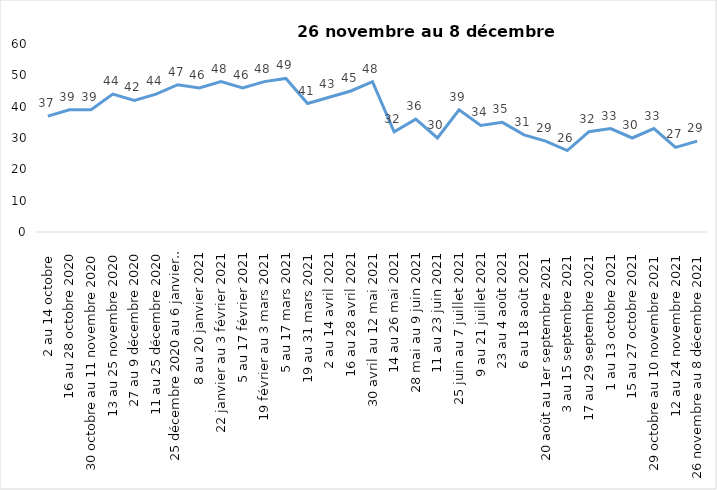
| Category | Toujours aux trois mesures |
|---|---|
| 2 au 14 octobre  | 37 |
| 16 au 28 octobre 2020 | 39 |
| 30 octobre au 11 novembre 2020 | 39 |
| 13 au 25 novembre 2020 | 44 |
| 27 au 9 décembre 2020 | 42 |
| 11 au 25 décembre 2020 | 44 |
| 25 décembre 2020 au 6 janvier  2021 | 47 |
| 8 au 20 janvier 2021 | 46 |
| 22 janvier au 3 février 2021 | 48 |
| 5 au 17 février 2021 | 46 |
| 19 février au 3 mars 2021 | 48 |
| 5 au 17 mars 2021 | 49 |
| 19 au 31 mars 2021 | 41 |
| 2 au 14 avril 2021 | 43 |
| 16 au 28 avril 2021 | 45 |
| 30 avril au 12 mai 2021 | 48 |
| 14 au 26 mai 2021 | 32 |
| 28 mai au 9 juin 2021 | 36 |
| 11 au 23 juin 2021 | 30 |
| 25 juin au 7 juillet 2021 | 39 |
| 9 au 21 juillet 2021 | 34 |
| 23 au 4 août 2021 | 35 |
| 6 au 18 août 2021 | 31 |
| 20 août au 1er septembre 2021 | 29 |
| 3 au 15 septembre 2021 | 26 |
| 17 au 29 septembre 2021 | 32 |
| 1 au 13 octobre 2021 | 33 |
| 15 au 27 octobre 2021 | 30 |
| 29 octobre au 10 novembre 2021 | 33 |
| 12 au 24 novembre 2021 | 27 |
| 26 novembre au 8 décembre 2021 | 29 |